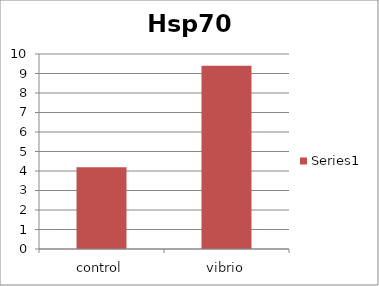
| Category | Series 0 |
|---|---|
| control | 4.192 |
| vibrio | 9.398 |